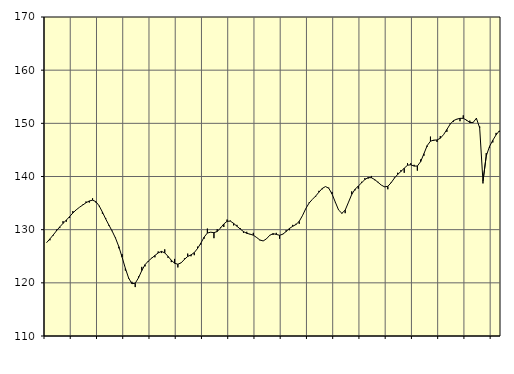
| Category | Piggar | Samtliga sysselsatta (inkl. sysselsatta utomlands)1 |
|---|---|---|
| nan | 127.6 | 127.57 |
| 87.0 | 128 | 128.26 |
| 87.0 | 128.9 | 129 |
| 87.0 | 130 | 129.78 |
| nan | 130.3 | 130.52 |
| 88.0 | 131.6 | 131.18 |
| 88.0 | 131.5 | 131.8 |
| 88.0 | 132.2 | 132.46 |
| nan | 133.5 | 133.14 |
| 89.0 | 133.7 | 133.72 |
| 89.0 | 134.2 | 134.21 |
| 89.0 | 134.7 | 134.63 |
| nan | 135.3 | 135.06 |
| 90.0 | 135.1 | 135.4 |
| 90.0 | 135.9 | 135.55 |
| 90.0 | 135.1 | 135.28 |
| nan | 134.4 | 134.49 |
| 91.0 | 133 | 133.31 |
| 91.0 | 132.2 | 132.01 |
| 91.0 | 130.7 | 130.84 |
| nan | 129.8 | 129.69 |
| 92.0 | 128.5 | 128.4 |
| 92.0 | 126.5 | 126.81 |
| 92.0 | 125.4 | 124.83 |
| nan | 122.3 | 122.72 |
| 93.0 | 120.8 | 120.89 |
| 93.0 | 120.2 | 119.84 |
| 93.0 | 119.2 | 119.92 |
| nan | 121.2 | 120.93 |
| 94.0 | 123 | 122.3 |
| 94.0 | 123.1 | 123.42 |
| 94.0 | 124 | 124.1 |
| nan | 124.7 | 124.63 |
| 95.0 | 124.8 | 125.14 |
| 95.0 | 125.9 | 125.63 |
| 95.0 | 125.6 | 125.91 |
| nan | 126.3 | 125.64 |
| 96.0 | 124.7 | 124.98 |
| 96.0 | 123.9 | 124.25 |
| 96.0 | 124.5 | 123.69 |
| nan | 122.9 | 123.5 |
| 97.0 | 123.8 | 123.76 |
| 97.0 | 124.6 | 124.41 |
| 97.0 | 125.5 | 124.96 |
| nan | 125 | 125.25 |
| 98.0 | 125.2 | 125.69 |
| 98.0 | 126.8 | 126.46 |
| 98.0 | 127.2 | 127.45 |
| nan | 128.3 | 128.59 |
| 99.0 | 130.2 | 129.37 |
| 99.0 | 129.5 | 129.52 |
| 99.0 | 128.4 | 129.44 |
| nan | 130.1 | 129.65 |
| 0.0 | 130.4 | 130.31 |
| 0.0 | 130.5 | 131.07 |
| 0.0 | 131.9 | 131.57 |
| nan | 131.7 | 131.61 |
| 1.0 | 130.8 | 131.18 |
| 1.0 | 130.9 | 130.65 |
| 1.0 | 130.3 | 130.13 |
| nan | 129.4 | 129.64 |
| 2.0 | 129.6 | 129.31 |
| 2.0 | 129.1 | 129.16 |
| 2.0 | 129.4 | 128.96 |
| nan | 128.5 | 128.53 |
| 3.0 | 128 | 128.06 |
| 3.0 | 127.9 | 127.88 |
| 3.0 | 128.3 | 128.27 |
| nan | 129 | 128.94 |
| 4.0 | 129 | 129.25 |
| 4.0 | 129.4 | 129.11 |
| 4.0 | 128.3 | 128.94 |
| nan | 129.2 | 129.15 |
| 5.0 | 129.9 | 129.65 |
| 5.0 | 129.9 | 130.22 |
| 5.0 | 130.9 | 130.63 |
| nan | 131.1 | 130.97 |
| 6.0 | 131.1 | 131.57 |
| 6.0 | 132.7 | 132.66 |
| 6.0 | 134 | 133.97 |
| nan | 135.1 | 135 |
| 7.0 | 135.7 | 135.7 |
| 7.0 | 136.2 | 136.32 |
| 7.0 | 137.3 | 137.05 |
| nan | 137.6 | 137.75 |
| 8.0 | 138.1 | 138.11 |
| 8.0 | 137.9 | 137.79 |
| 8.0 | 137.1 | 136.7 |
| nan | 135.1 | 135.17 |
| 9.0 | 133.7 | 133.69 |
| 9.0 | 133 | 133.08 |
| 9.0 | 133.1 | 133.67 |
| nan | 135.1 | 135.14 |
| 10.0 | 137.2 | 136.63 |
| 10.0 | 137.4 | 137.59 |
| 10.0 | 137.7 | 138.2 |
| nan | 139 | 138.81 |
| 11.0 | 139.7 | 139.42 |
| 11.0 | 139.6 | 139.8 |
| 11.0 | 140.1 | 139.77 |
| nan | 139.3 | 139.42 |
| 12.0 | 139 | 138.91 |
| 12.0 | 138.4 | 138.39 |
| 12.0 | 138.1 | 138.05 |
| nan | 137.6 | 138.15 |
| 13.0 | 138.9 | 138.82 |
| 13.0 | 139.8 | 139.69 |
| 13.0 | 140.7 | 140.39 |
| nan | 141.2 | 140.95 |
| 14.0 | 140.7 | 141.56 |
| 14.0 | 142.5 | 142.12 |
| 14.0 | 142.5 | 142.21 |
| nan | 142.2 | 141.96 |
| 15.0 | 141.1 | 141.97 |
| 15.0 | 143.2 | 142.79 |
| 15.0 | 143.9 | 144.28 |
| nan | 145.6 | 145.81 |
| 16.0 | 147.5 | 146.64 |
| 16.0 | 146.7 | 146.84 |
| 16.0 | 146.5 | 146.87 |
| nan | 147.6 | 147.19 |
| 17.0 | 147.9 | 147.88 |
| 17.0 | 148.4 | 148.84 |
| 17.0 | 150 | 149.84 |
| nan | 150.3 | 150.5 |
| 18.0 | 150.7 | 150.78 |
| 18.0 | 150.4 | 150.94 |
| 18.0 | 151.5 | 150.94 |
| nan | 150.5 | 150.6 |
| 19.0 | 150.5 | 150.15 |
| 19.0 | 150.1 | 150.17 |
| 19.0 | 150.8 | 150.95 |
| nan | 149.4 | 149.15 |
| 20.0 | 138.7 | 139.08 |
| 20.0 | 144.4 | 143.87 |
| 20.0 | 145.4 | 145.65 |
| nan | 146.4 | 146.81 |
| 21.0 | 148.2 | 147.83 |
| 21.0 | 148.4 | 148.59 |